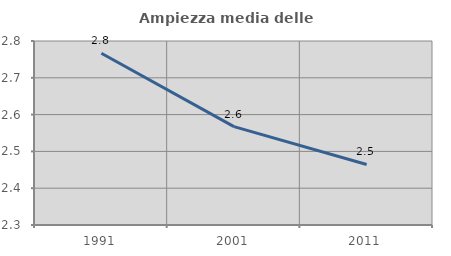
| Category | Ampiezza media delle famiglie |
|---|---|
| 1991.0 | 2.767 |
| 2001.0 | 2.567 |
| 2011.0 | 2.464 |